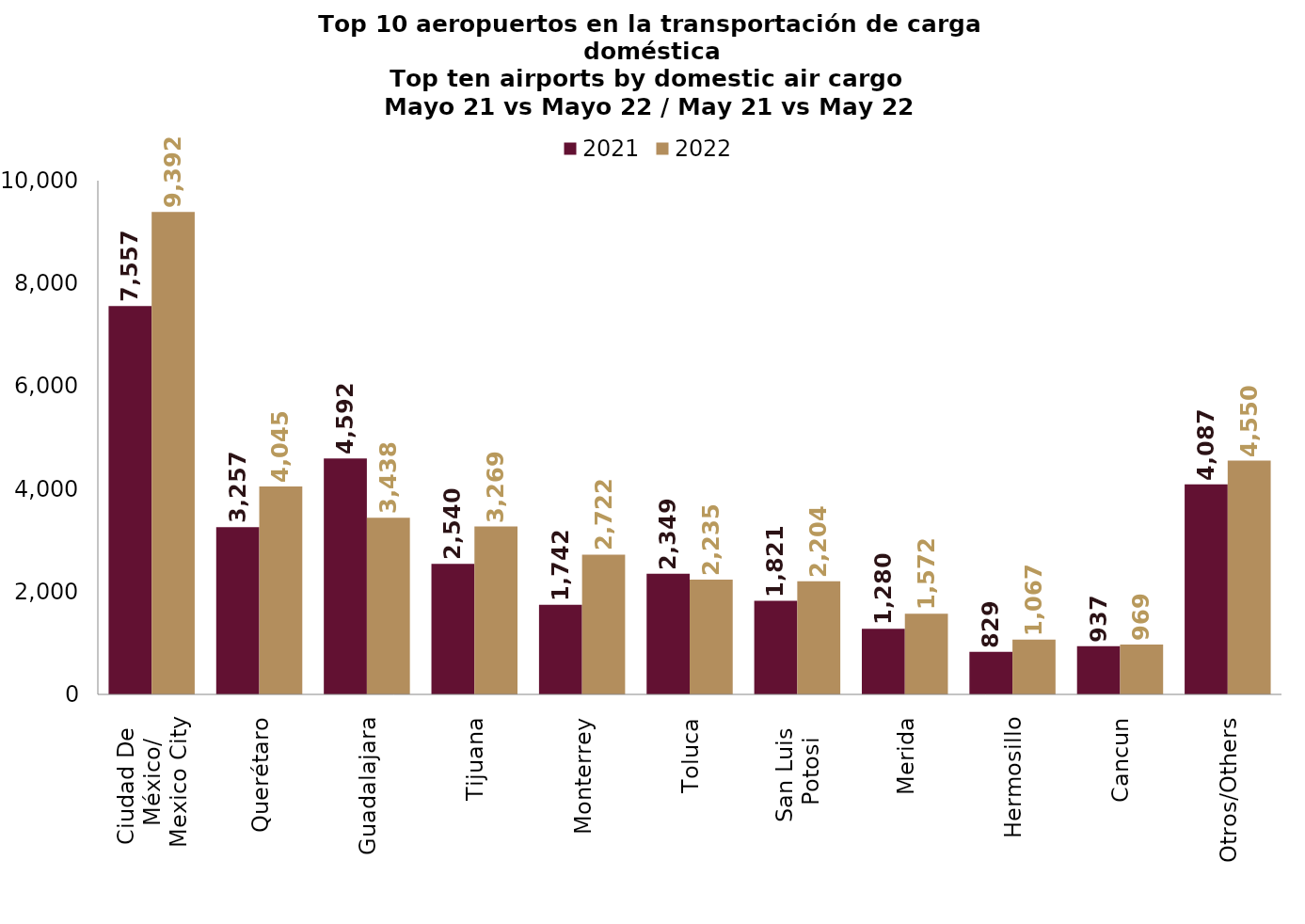
| Category | 2021 | 2022 |
|---|---|---|
| Ciudad De 
México/
Mexico City | 7557.3 | 9392.057 |
| Querétaro | 3257.171 | 4045.377 |
| Guadalajara | 4591.657 | 3438.043 |
| Tijuana | 2540.278 | 3268.534 |
| Monterrey | 1742.361 | 2721.942 |
| Toluca | 2348.965 | 2234.589 |
| San Luis 
Potosi | 1821.003 | 2204.482 |
| Merida | 1279.59 | 1571.751 |
| Hermosillo | 828.949 | 1067.345 |
| Cancun | 936.735 | 968.66 |
| Otros/Others | 4086.919 | 4550.106 |